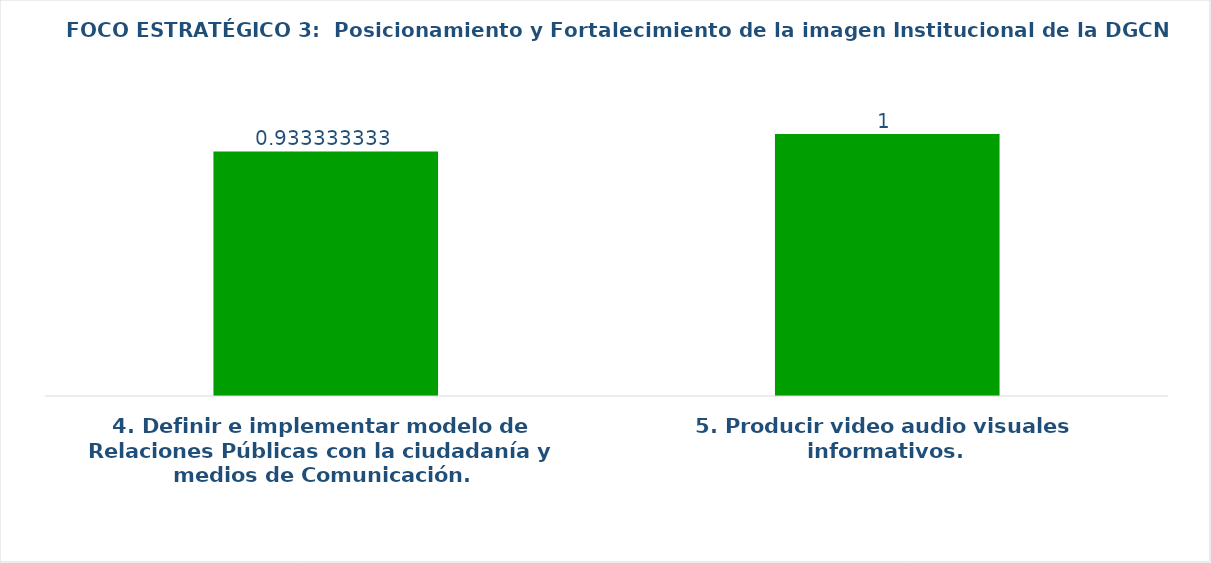
| Category | Series 0 |
|---|---|
| 4. Definir e implementar modelo de Relaciones Públicas con la ciudadanía y medios de Comunicación. | 0.933 |
| 5. Producir video audio visuales informativos. | 1 |